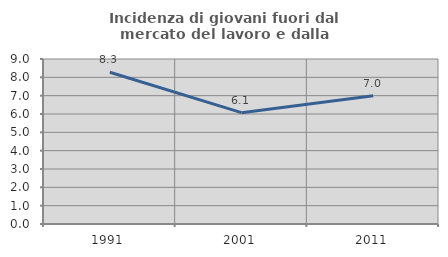
| Category | Incidenza di giovani fuori dal mercato del lavoro e dalla formazione  |
|---|---|
| 1991.0 | 8.279 |
| 2001.0 | 6.072 |
| 2011.0 | 6.993 |